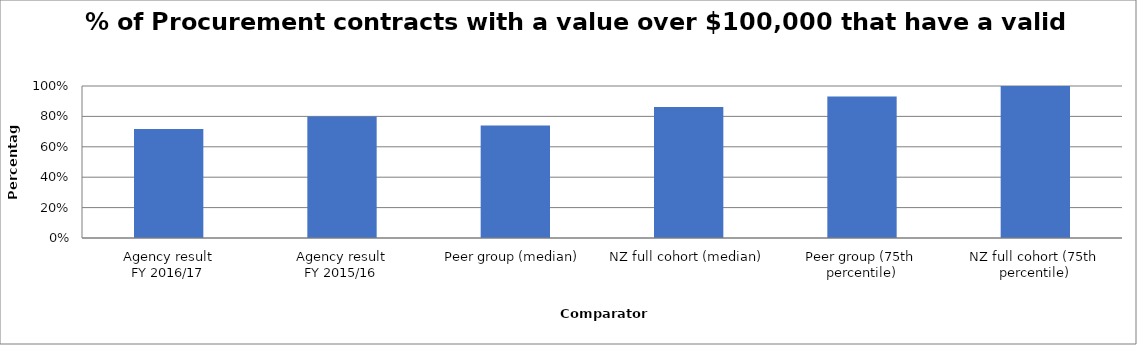
| Category | Series 0 |
|---|---|
| Agency result
FY 2016/17 | 0.717 |
| Agency result
FY 2015/16 | 0.799 |
| Peer group (median) | 0.74 |
| NZ full cohort (median) | 0.862 |
| Peer group (75th percentile) | 0.931 |
| NZ full cohort (75th percentile) | 1 |